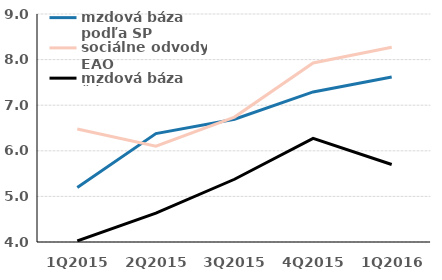
| Category | mzdová báza podľa SP | sociálne odvody EAO | mzdová báza ŠÚSR |
|---|---|---|---|
| 1Q2015 | 5.196 | 6.478 | 4.024 |
| 2Q2015 | 6.377 | 6.102 | 4.631 |
| 3Q2015 | 6.693 | 6.74 | 5.376 |
| 4Q2015 | 7.291 | 7.925 | 6.273 |
| 1Q2016 | 7.619 | 8.272 | 5.699 |